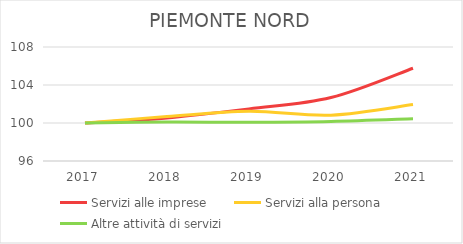
| Category | Servizi alle imprese | Servizi alla persona | Altre attività di servizi |
|---|---|---|---|
| 2017.0 | 100 | 100 | 100 |
| 2018.0 | 100.532 | 100.676 | 100.102 |
| 2019.0 | 101.487 | 101.234 | 100.074 |
| 2020.0 | 102.677 | 100.828 | 100.157 |
| 2021.0 | 105.761 | 101.943 | 100.443 |